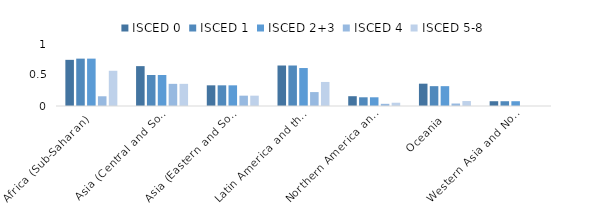
| Category | ISCED 0 | ISCED 1 | ISCED 2+3 | ISCED 4 | ISCED 5-8 |
|---|---|---|---|---|---|
| Africa (Sub-Saharan)  | 0.745 | 0.764 | 0.764 | 0.157 | 0.568 |
| Asia (Central and Southern) | 0.643 | 0.5 | 0.5 | 0.357 | 0.357 |
| Asia (Eastern and South-eastern) | 0.333 | 0.333 | 0.333 | 0.167 | 0.167 |
| Latin America and the Caribbean | 0.653 | 0.653 | 0.612 | 0.225 | 0.388 |
| Northern America and Europe | 0.158 | 0.14 | 0.14 | 0.035 | 0.053 |
| Oceania | 0.36 | 0.32 | 0.32 | 0.04 | 0.08 |
| Western Asia and Northern Africa | 0.077 | 0.077 | 0.077 | 0 | 0 |